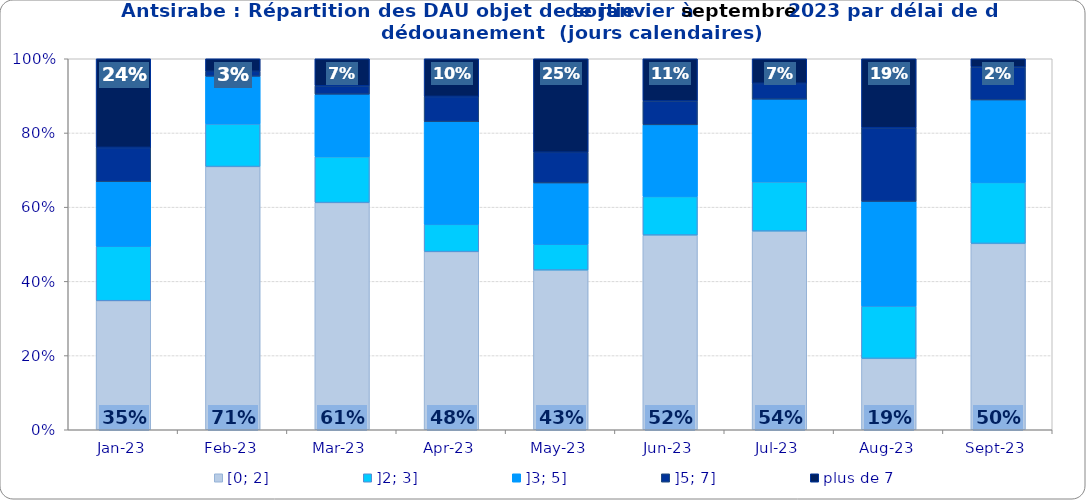
| Category | [0; 2] | ]2; 3] | ]3; 5] | ]5; 7] | plus de 7 |
|---|---|---|---|---|---|
| 2023-01-01 | 0.348 | 0.147 | 0.174 | 0.092 | 0.239 |
| 2023-02-01 | 0.709 | 0.115 | 0.128 | 0.014 | 0.034 |
| 2023-03-01 | 0.612 | 0.124 | 0.169 | 0.022 | 0.073 |
| 2023-04-01 | 0.48 | 0.073 | 0.277 | 0.068 | 0.102 |
| 2023-05-01 | 0.43 | 0.07 | 0.165 | 0.083 | 0.252 |
| 2023-06-01 | 0.525 | 0.104 | 0.193 | 0.064 | 0.114 |
| 2023-07-01 | 0.536 | 0.133 | 0.223 | 0.043 | 0.066 |
| 2023-08-01 | 0.192 | 0.141 | 0.282 | 0.199 | 0.186 |
| 2023-09-01 | 0.502 | 0.164 | 0.222 | 0.089 | 0.022 |